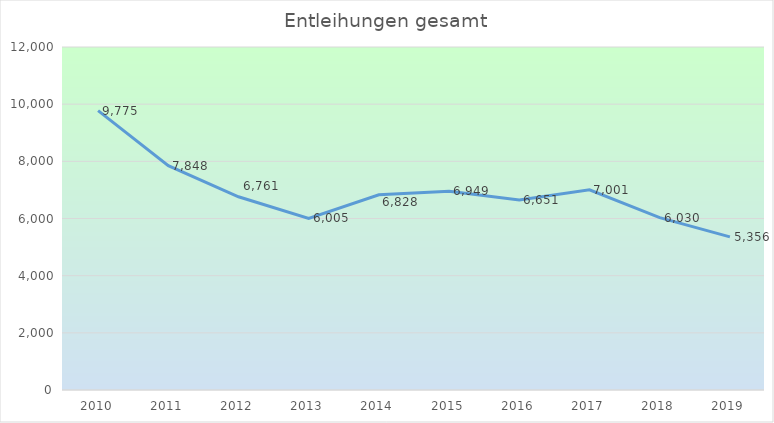
| Category | Entleihungen gesamt |
|---|---|
| 2010.0 | 9775 |
| 2011.0 | 7848 |
| 2012.0 | 6761 |
| 2013.0 | 6005 |
| 2014.0 | 6828 |
| 2015.0 | 6949 |
| 2016.0 | 6651 |
| 2017.0 | 7001 |
| 2018.0 | 6030 |
| 2019.0 | 5356 |